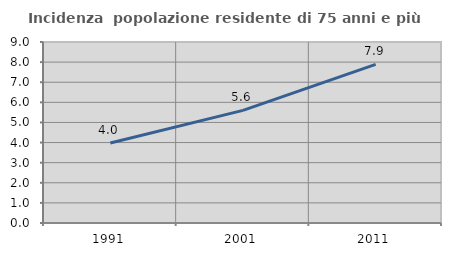
| Category | Incidenza  popolazione residente di 75 anni e più |
|---|---|
| 1991.0 | 3.976 |
| 2001.0 | 5.602 |
| 2011.0 | 7.884 |